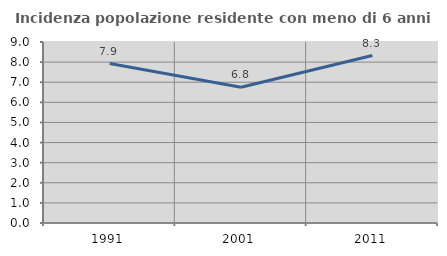
| Category | Incidenza popolazione residente con meno di 6 anni |
|---|---|
| 1991.0 | 7.928 |
| 2001.0 | 6.75 |
| 2011.0 | 8.327 |